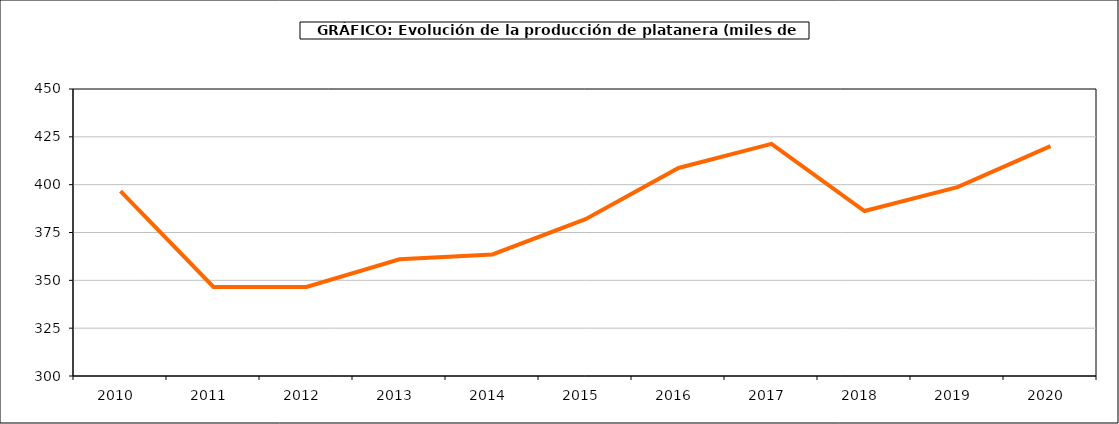
| Category | producción platanera |
|---|---|
| 2010.0 | 396.589 |
| 2011.0 | 346.509 |
| 2012.0 | 346.509 |
| 2013.0 | 360.987 |
| 2014.0 | 363.552 |
| 2015.0 | 381.983 |
| 2016.0 | 408.716 |
| 2017.0 | 421.313 |
| 2018.0 | 386.226 |
| 2019.0 | 398.722 |
| 2020.0 | 420.144 |